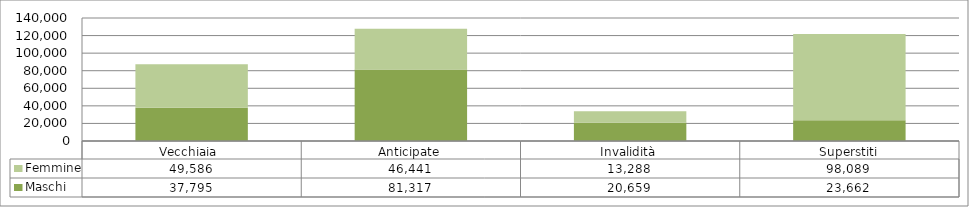
| Category | Maschi | Femmine |
|---|---|---|
| Vecchiaia  | 37795 | 49586 |
| Anticipate | 81317 | 46441 |
| Invalidità | 20659 | 13288 |
| Superstiti | 23662 | 98089 |